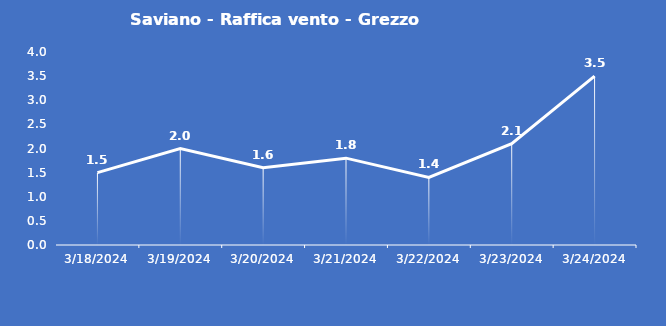
| Category | Saviano - Raffica vento - Grezzo (m/s) |
|---|---|
| 3/18/24 | 1.5 |
| 3/19/24 | 2 |
| 3/20/24 | 1.6 |
| 3/21/24 | 1.8 |
| 3/22/24 | 1.4 |
| 3/23/24 | 2.1 |
| 3/24/24 | 3.5 |